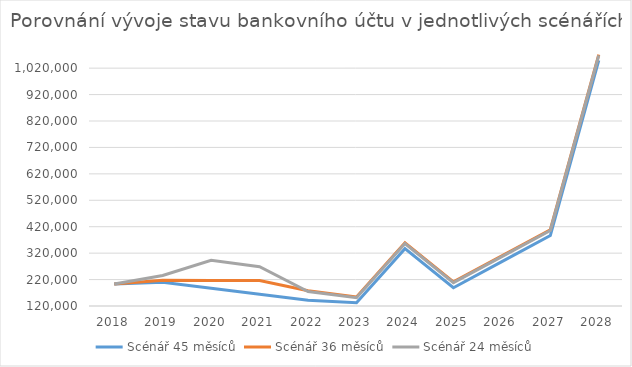
| Category | Scénář 45 měsíců | Scénář 36 měsíců | Scénář 24 měsíců |
|---|---|---|---|
| 2018.0 | 203006 | 203006 | 203006 |
| 2019.0 | 209985.891 | 217319.333 | 235652.667 |
| 2020.0 | 187099.942 | 216484.667 | 292818 |
| 2021.0 | 164613.993 | 216050 | 268716.667 |
| 2022.0 | 142028.045 | 177848.667 | 174848.667 |
| 2023.0 | 132445.558 | 154445.667 | 151445.667 |
| 2024.0 | 337040.558 | 359040.667 | 356040.667 |
| 2025.0 | 189192.558 | 211192.667 | 208192.667 |
| 2026.0 | 287644.558 | 309644.667 | 306644.667 |
| 2027.0 | 386596.558 | 408596.667 | 405596.667 |
| 2028.0 | 1049041.558 | 1071041.667 | 1068041.667 |